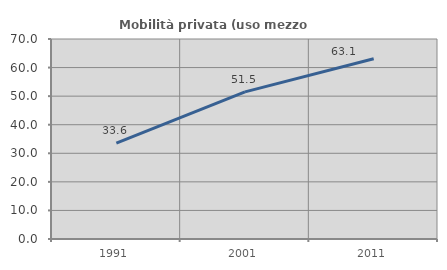
| Category | Mobilità privata (uso mezzo privato) |
|---|---|
| 1991.0 | 33.572 |
| 2001.0 | 51.485 |
| 2011.0 | 63.097 |